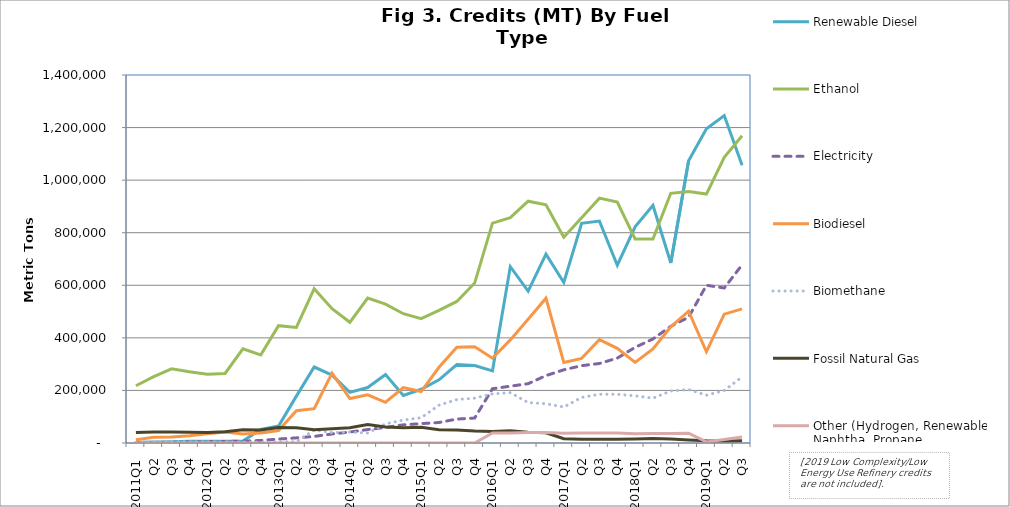
| Category | Renewable Diesel  | Ethanol | Electricity | Biodiesel | Biomethane | Fossil Natural Gas | Other (Hydrogen, Renewable Naphtha, Propane, Innovative Crude & Low Complexity / Low Energy Use Refining, etc.) |
|---|---|---|---|---|---|---|---|
| 2011Q1 | 3070 | 217913 | 459 | 12300 | 2212 | 39934 | 0 |
| Q2 | 3368 | 252550 | 1293 | 21555 | 3069 | 42169 | 0 |
| Q3 | 4362 | 282189 | 2455 | 22424 | 4960 | 41443 | 0 |
| Q4 | 6220 | 270901 | 3536 | 27988 | 4474 | 40844 | 0 |
| 2012Q1 | 6701 | 261269 | 4519 | 35382 | 4367 | 40226 | 0 |
| Q2 | 6804 | 264615 | 5560 | 41919 | 4221 | 43158 | 0 |
| Q3 | 7938 | 358459 | 7294 | 34052 | 3577 | 49942 | 0 |
| Q4 | 51216 | 334751 | 9611 | 37994 | 2680 | 49844 | 0 |
| 2013Q1 | 64445 | 446344 | 15051 | 47386 | 4240 | 59246 | 0 |
| Q2 | 178293 | 439633 | 19516 | 123072 | 5183 | 58045 | 0 |
| Q3 | 288998 | 586902 | 25039 | 130475 | 49133 | 50799 | 0 |
| Q4 | 258193 | 510999 | 34347 | 265737 | 39562 | 53765 | 0 |
| 2014Q1 | 192407 | 459238 | 41753 | 169218 | 41739 | 57641 | 0 |
| Q2 | 211004 | 551332 | 51092 | 183308 | 37894 | 70355 | 0 |
| Q3 | 260522 | 528433 | 59366 | 154934 | 72586 | 60793 | 0 |
| Q4 | 181046 | 491880 | 69119 | 210540 | 87339 | 58227 | 0 |
| 2015Q1 | 204352 | 473209 | 73708 | 195615 | 95988 | 59759 | 0 |
| Q2 | 240167 | 504542 | 78072 | 287973 | 143767 | 50798 | 0 |
| Q3 | 298591 | 538519 | 91036 | 364501 | 165250 | 49738 | 50 |
| Q4 | 295061 | 608484 | 94924 | 365821 | 170608 | 45811 | 24 |
| 2016Q1 | 274568 | 836629 | 206464 | 322607 | 186692 | 43789 | 37975 |
| Q2 | 670559 | 857168 | 216149 | 392318 | 191536 | 46764 | 38243 |
| Q3 | 577586 | 919750 | 225640 | 470922 | 153853 | 41125 | 39843 |
| Q4 | 718504 | 905839 | 256450 | 550936 | 149608 | 39072 | 39493 |
| 2017Q1 | 610652 | 783039 | 278442 | 306640 | 136721 | 16031 | 37028 |
| Q2 | 835625 | 856950 | 294201 | 321909 | 173497 | 14323 | 37617 |
| Q3 | 844159 | 931601 | 302457 | 393587 | 185321 | 14005 | 37717 |
| Q4 | 676294 | 916634 | 323014 | 359942 | 185446 | 14135 | 37644 |
| 2018Q1 | 822711 | 776336 | 363841 | 306337 | 179507 | 15292 | 35569 |
| Q2 | 904125 | 775942 | 395740 | 357508 | 170495 | 16964 | 36090 |
| Q3 | 684773 | 949941 | 443883 | 442007 | 197971 | 14909 | 36240 |
| Q4 | 1073782 | 956765 | 478716 | 501294 | 203315 | 11610 | 37400 |
| 2019Q1 | 1195556 | 946879 | 600060 | 347140 | 181925 | 8133 | 4226 |
| Q2 | 1245746 | 1086445 | 589675 | 490163 | 199946 | 7175 | 13357 |
| Q3 | 1056305 | 1168961 | 677748 | 510096 | 251536 | 8185 | 22430 |